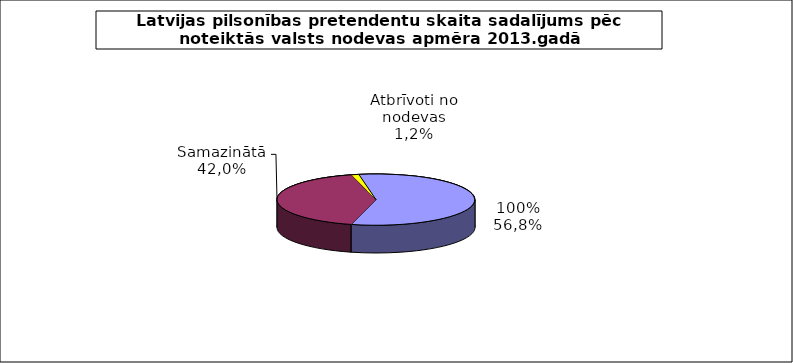
| Category | Series 0 |
|---|---|
|              100% | 0.568 |
|              Samazinātā | 0.42 |
|              Atbrīvoti no nodevas | 0.012 |